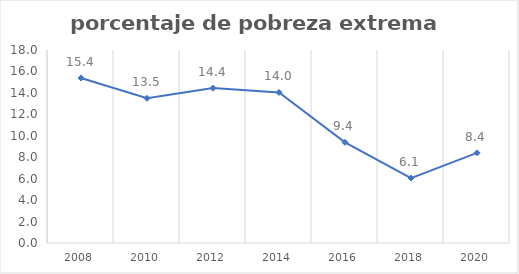
| Category | Series 0 |
|---|---|
| 2008.0 | 15.389 |
| 2010.0 | 13.496 |
| 2012.0 | 14.445 |
| 2014.0 | 14.04 |
| 2016.0 | 9.389 |
| 2018.0 | 6.056 |
| 2020.0 | 8.408 |